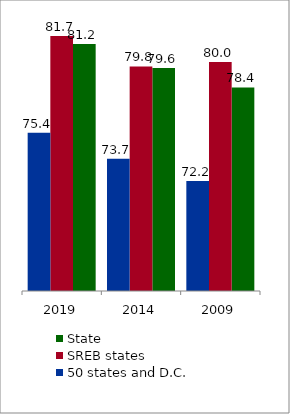
| Category | State | SREB states | 50 states and D.C. |
|---|---|---|---|
| 2009.0 | 78.377 | 80.043 | 72.228 |
| 2014.0 | 79.647 | 79.752 | 73.685 |
| 2019.0 | 81.232 | 81.745 | 75.388 |